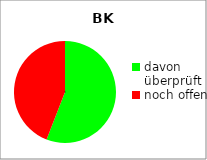
| Category | BK |
|---|---|
| davon überprüft | 19 |
| noch offen | 15 |